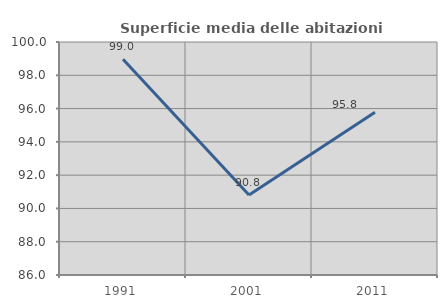
| Category | Superficie media delle abitazioni occupate |
|---|---|
| 1991.0 | 98.958 |
| 2001.0 | 90.808 |
| 2011.0 | 95.775 |